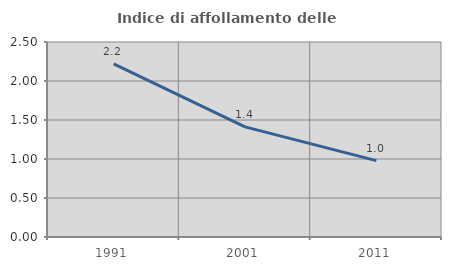
| Category | Indice di affollamento delle abitazioni  |
|---|---|
| 1991.0 | 2.221 |
| 2001.0 | 1.412 |
| 2011.0 | 0.979 |